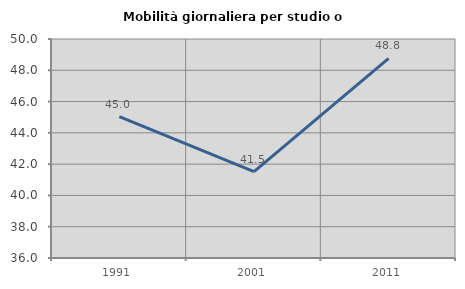
| Category | Mobilità giornaliera per studio o lavoro |
|---|---|
| 1991.0 | 45.032 |
| 2001.0 | 41.517 |
| 2011.0 | 48.762 |